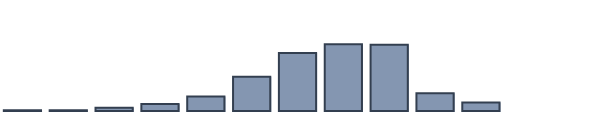
| Category | Series 0 |
|---|---|
| 0 | 0.227 |
| 1 | 0.303 |
| 2 | 1.136 |
| 3 | 2.5 |
| 4 | 5.227 |
| 5 | 12.348 |
| 6 | 20.909 |
| 7 | 24.015 |
| 8 | 23.864 |
| 9 | 6.364 |
| 10 | 3.106 |
| 11 | 0 |
| 12 | 0 |